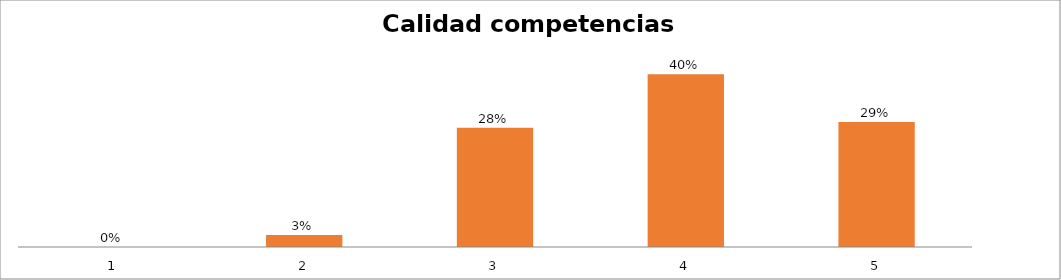
| Category | Series 1 |
|---|---|
| 0 | 0 |
| 1 | 0.028 |
| 2 | 0.278 |
| 3 | 0.403 |
| 4 | 0.292 |